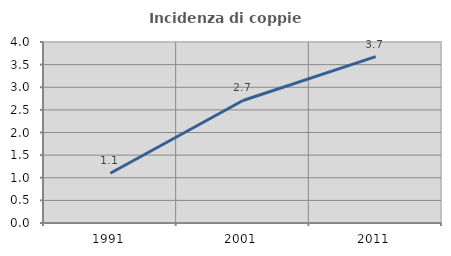
| Category | Incidenza di coppie miste |
|---|---|
| 1991.0 | 1.1 |
| 2001.0 | 2.707 |
| 2011.0 | 3.678 |